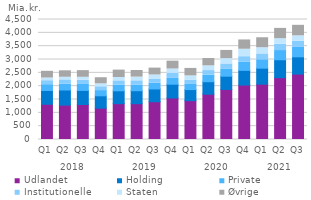
| Category | Udlandet | Holding | Private | Institutionelle | Staten | Øvrige |
|---|---|---|---|---|---|---|
| 0 | 1321.814 | 516.743 | 217.231 | 148.881 | 100.121 | 252.139 |
| 1 | 1289.976 | 566.59 | 223.297 | 154.966 | 99.059 | 242.019 |
| 2 | 1313.494 | 528.238 | 223.142 | 158.151 | 109.609 | 249.521 |
| 3 | 1175.011 | 463.526 | 195.783 | 143.417 | 109.353 | 228.696 |
| 4 | 1344.303 | 482.684 | 216.089 | 155.85 | 125.29 | 277.274 |
| 5 | 1342.616 | 487.172 | 213.239 | 157.545 | 138.421 | 247.888 |
| 6 | 1416.257 | 479.141 | 215.218 | 156.634 | 152.741 | 257.227 |
| 7 | 1557.556 | 516.039 | 234.397 | 171.653 | 163.772 | 294.382 |
| 8 | 1455.648 | 415.701 | 213.266 | 142.935 | 157.399 | 280.423 |
| 9 | 1698.089 | 468.748 | 248.622 | 169.344 | 176.07 | 277.118 |
| 10 | 1878.092 | 495.91 | 271.116 | 188.773 | 199.175 | 306.934 |
| 11 | 2041.71 | 551.956 | 298.639 | 213.138 | 279.014 | 348.375 |
| 12 | 2075.426 | 599.298 | 315.066 | 218.018 | 234.427 | 372.491 |
| 13 | 2319.268 | 670.646 | 345.933 | 235.146 | 209.259 | 386.919 |
| 14 | 2453.255 | 647.551 | 352.574 | 233.582 | 200.355 | 394.789 |